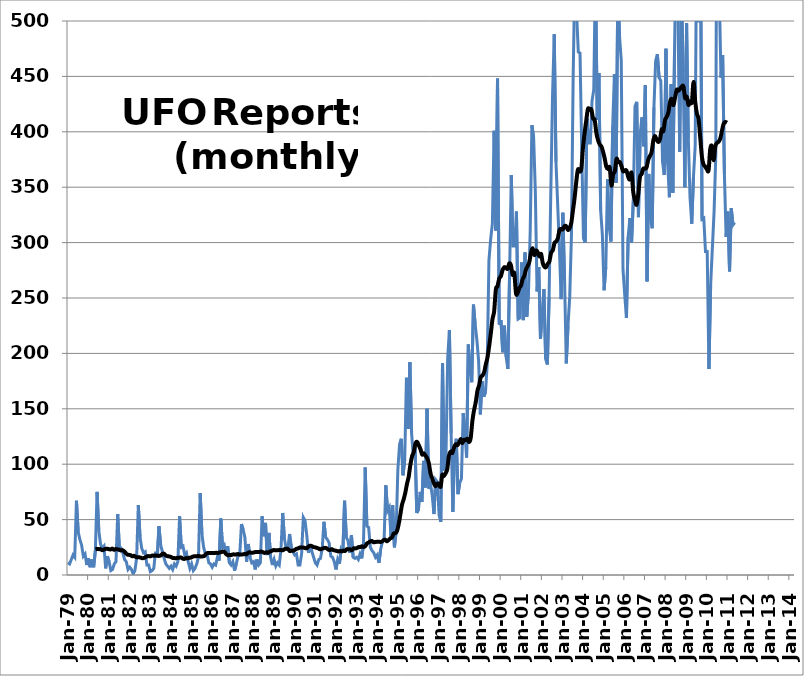
| Category | Series 0 |
|---|---|
| 1979-01-01 | 11 |
| 1979-02-01 | 10 |
| 1979-03-01 | 14 |
| 1979-04-01 | 18 |
| 1979-05-01 | 16 |
| 1979-06-01 | 67 |
| 1979-07-01 | 39 |
| 1979-08-01 | 32 |
| 1979-09-01 | 27 |
| 1979-10-01 | 17 |
| 1979-11-01 | 19 |
| 1979-12-01 | 9 |
| 1980-01-01 | 15 |
| 1980-02-01 | 7 |
| 1980-03-01 | 14 |
| 1980-04-01 | 7 |
| 1980-05-01 | 22 |
| 1980-06-01 | 75 |
| 1980-07-01 | 40 |
| 1980-08-01 | 28 |
| 1980-09-01 | 24 |
| 1980-10-01 | 26 |
| 1980-11-01 | 6 |
| 1980-12-01 | 17 |
| 1981-01-01 | 12 |
| 1981-02-01 | 4 |
| 1981-03-01 | 5 |
| 1981-04-01 | 10 |
| 1981-05-01 | 12 |
| 1981-06-01 | 55 |
| 1981-07-01 | 23 |
| 1981-08-01 | 24 |
| 1981-09-01 | 20 |
| 1981-10-01 | 14 |
| 1981-11-01 | 12 |
| 1981-12-01 | 5 |
| 1982-01-01 | 7 |
| 1982-02-01 | 5 |
| 1982-03-01 | 1 |
| 1982-04-01 | 4 |
| 1982-05-01 | 15 |
| 1982-06-01 | 63 |
| 1982-07-01 | 34 |
| 1982-08-01 | 24 |
| 1982-09-01 | 20 |
| 1982-10-01 | 21 |
| 1982-11-01 | 9 |
| 1982-12-01 | 9 |
| 1983-01-01 | 3 |
| 1983-02-01 | 4 |
| 1983-03-01 | 6 |
| 1983-04-01 | 21 |
| 1983-05-01 | 16 |
| 1983-06-01 | 44 |
| 1983-07-01 | 27 |
| 1983-08-01 | 21 |
| 1983-09-01 | 15 |
| 1983-10-01 | 10 |
| 1983-11-01 | 8 |
| 1983-12-01 | 6 |
| 1984-01-01 | 8 |
| 1984-02-01 | 5 |
| 1984-03-01 | 10 |
| 1984-04-01 | 8 |
| 1984-05-01 | 12 |
| 1984-06-01 | 53 |
| 1984-07-01 | 25 |
| 1984-08-01 | 26 |
| 1984-09-01 | 18 |
| 1984-10-01 | 20 |
| 1984-11-01 | 12 |
| 1984-12-01 | 6 |
| 1985-01-01 | 10 |
| 1985-02-01 | 4 |
| 1985-03-01 | 6 |
| 1985-04-01 | 10 |
| 1985-05-01 | 16 |
| 1985-06-01 | 74 |
| 1985-07-01 | 37 |
| 1985-08-01 | 25 |
| 1985-09-01 | 19 |
| 1985-10-01 | 19 |
| 1985-11-01 | 11 |
| 1985-12-01 | 10 |
| 1986-01-01 | 7 |
| 1986-02-01 | 10 |
| 1986-03-01 | 9 |
| 1986-04-01 | 16 |
| 1986-05-01 | 13 |
| 1986-06-01 | 51 |
| 1986-07-01 | 25 |
| 1986-08-01 | 27 |
| 1986-09-01 | 18 |
| 1986-10-01 | 26 |
| 1986-11-01 | 11 |
| 1986-12-01 | 9 |
| 1987-01-01 | 12 |
| 1987-02-01 | 4 |
| 1987-03-01 | 10 |
| 1987-04-01 | 17 |
| 1987-05-01 | 18 |
| 1987-06-01 | 46 |
| 1987-07-01 | 41 |
| 1987-08-01 | 34 |
| 1987-09-01 | 12 |
| 1987-10-01 | 28 |
| 1987-11-01 | 16 |
| 1987-12-01 | 11 |
| 1988-01-01 | 12 |
| 1988-02-01 | 5 |
| 1988-03-01 | 14 |
| 1988-04-01 | 9 |
| 1988-05-01 | 11 |
| 1988-06-01 | 53 |
| 1988-07-01 | 35 |
| 1988-08-01 | 47 |
| 1988-09-01 | 18 |
| 1988-10-01 | 38 |
| 1988-11-01 | 16 |
| 1988-12-01 | 9 |
| 1989-01-01 | 14 |
| 1989-02-01 | 8 |
| 1989-03-01 | 11 |
| 1989-04-01 | 9 |
| 1989-05-01 | 23 |
| 1989-06-01 | 56 |
| 1989-07-01 | 33 |
| 1989-08-01 | 24 |
| 1989-09-01 | 23 |
| 1989-10-01 | 37 |
| 1989-11-01 | 25 |
| 1989-12-01 | 21 |
| 1990-01-01 | 18 |
| 1990-02-01 | 19 |
| 1990-03-01 | 9 |
| 1990-04-01 | 9 |
| 1990-05-01 | 19 |
| 1990-06-01 | 52 |
| 1990-07-01 | 49 |
| 1990-08-01 | 36 |
| 1990-09-01 | 20 |
| 1990-10-01 | 27 |
| 1990-11-01 | 21 |
| 1990-12-01 | 16 |
| 1991-01-01 | 11 |
| 1991-02-01 | 9 |
| 1991-03-01 | 14 |
| 1991-04-01 | 15 |
| 1991-05-01 | 24 |
| 1991-06-01 | 48 |
| 1991-07-01 | 34 |
| 1991-08-01 | 32 |
| 1991-09-01 | 29 |
| 1991-10-01 | 17 |
| 1991-11-01 | 16 |
| 1991-12-01 | 12 |
| 1992-01-01 | 5 |
| 1992-02-01 | 14 |
| 1992-03-01 | 10 |
| 1992-04-01 | 23 |
| 1992-05-01 | 20 |
| 1992-06-01 | 67 |
| 1992-07-01 | 34 |
| 1992-08-01 | 31 |
| 1992-09-01 | 20 |
| 1992-10-01 | 36 |
| 1992-11-01 | 16 |
| 1992-12-01 | 15 |
| 1993-01-01 | 16 |
| 1993-02-01 | 14 |
| 1993-03-01 | 19 |
| 1993-04-01 | 15 |
| 1993-05-01 | 28 |
| 1993-06-01 | 97 |
| 1993-07-01 | 44 |
| 1993-08-01 | 43 |
| 1993-09-01 | 25 |
| 1993-10-01 | 22 |
| 1993-11-01 | 20 |
| 1993-12-01 | 16 |
| 1994-01-01 | 18 |
| 1994-02-01 | 11 |
| 1994-03-01 | 23 |
| 1994-04-01 | 30 |
| 1994-05-01 | 32 |
| 1994-06-01 | 81 |
| 1994-07-01 | 58 |
| 1994-08-01 | 61 |
| 1994-09-01 | 35 |
| 1994-10-01 | 63 |
| 1994-11-01 | 25 |
| 1994-12-01 | 39 |
| 1995-01-01 | 95 |
| 1995-02-01 | 118 |
| 1995-03-01 | 123 |
| 1995-04-01 | 90 |
| 1995-05-01 | 104 |
| 1995-06-01 | 178 |
| 1995-07-01 | 132 |
| 1995-08-01 | 192 |
| 1995-09-01 | 128 |
| 1995-10-01 | 107 |
| 1995-11-01 | 118 |
| 1995-12-01 | 56 |
| 1996-01-01 | 59 |
| 1996-02-01 | 75 |
| 1996-03-01 | 66 |
| 1996-04-01 | 103 |
| 1996-05-01 | 79 |
| 1996-06-01 | 150 |
| 1996-07-01 | 78 |
| 1996-08-01 | 82 |
| 1996-09-01 | 72 |
| 1996-10-01 | 55 |
| 1996-11-01 | 86 |
| 1996-12-01 | 84 |
| 1997-01-01 | 54 |
| 1997-02-01 | 48 |
| 1997-03-01 | 191 |
| 1997-04-01 | 94 |
| 1997-05-01 | 107 |
| 1997-06-01 | 196 |
| 1997-07-01 | 221 |
| 1997-08-01 | 128 |
| 1997-09-01 | 57 |
| 1997-10-01 | 113 |
| 1997-11-01 | 123 |
| 1997-12-01 | 73 |
| 1998-01-01 | 83 |
| 1998-02-01 | 87 |
| 1998-03-01 | 146 |
| 1998-04-01 | 130 |
| 1998-05-01 | 106 |
| 1998-06-01 | 208 |
| 1998-07-01 | 185 |
| 1998-08-01 | 174 |
| 1998-09-01 | 244 |
| 1998-10-01 | 226 |
| 1998-11-01 | 212 |
| 1998-12-01 | 193 |
| 1999-01-01 | 145 |
| 1999-02-01 | 175 |
| 1999-03-01 | 161 |
| 1999-04-01 | 165 |
| 1999-05-01 | 190 |
| 1999-06-01 | 284 |
| 1999-07-01 | 303 |
| 1999-08-01 | 317 |
| 1999-09-01 | 401 |
| 1999-10-01 | 311 |
| 1999-11-01 | 448 |
| 1999-12-01 | 226 |
| 2000-01-01 | 230 |
| 2000-02-01 | 201 |
| 2000-03-01 | 225 |
| 2000-04-01 | 197 |
| 2000-05-01 | 186 |
| 2000-06-01 | 271 |
| 2000-07-01 | 361 |
| 2000-08-01 | 297 |
| 2000-09-01 | 297 |
| 2000-10-01 | 328 |
| 2000-11-01 | 231 |
| 2000-12-01 | 232 |
| 2001-01-01 | 282 |
| 2001-02-01 | 230 |
| 2001-03-01 | 291 |
| 2001-04-01 | 233 |
| 2001-05-01 | 255 |
| 2001-06-01 | 309 |
| 2001-07-01 | 406 |
| 2001-08-01 | 395 |
| 2001-09-01 | 346 |
| 2001-10-01 | 256 |
| 2001-11-01 | 278 |
| 2001-12-01 | 213 |
| 2002-01-01 | 237 |
| 2002-02-01 | 258 |
| 2002-03-01 | 195 |
| 2002-04-01 | 190 |
| 2002-05-01 | 251 |
| 2002-06-01 | 346 |
| 2002-07-01 | 432 |
| 2002-08-01 | 488 |
| 2002-09-01 | 373 |
| 2002-10-01 | 334 |
| 2002-11-01 | 295 |
| 2002-12-01 | 249 |
| 2003-01-01 | 327 |
| 2003-02-01 | 267 |
| 2003-03-01 | 191 |
| 2003-04-01 | 225 |
| 2003-05-01 | 251 |
| 2003-06-01 | 306 |
| 2003-07-01 | 449 |
| 2003-08-01 | 543 |
| 2003-09-01 | 507 |
| 2003-10-01 | 472 |
| 2003-11-01 | 471 |
| 2003-12-01 | 383 |
| 2004-01-01 | 304 |
| 2004-02-01 | 300 |
| 2004-03-01 | 412 |
| 2004-04-01 | 390 |
| 2004-05-01 | 390 |
| 2004-06-01 | 428 |
| 2004-07-01 | 438 |
| 2004-08-01 | 547 |
| 2004-09-01 | 411 |
| 2004-10-01 | 453 |
| 2004-11-01 | 329 |
| 2004-12-01 | 307 |
| 2005-01-01 | 257 |
| 2005-02-01 | 278 |
| 2005-03-01 | 357 |
| 2005-04-01 | 314 |
| 2005-05-01 | 301 |
| 2005-06-01 | 405 |
| 2005-07-01 | 452 |
| 2005-08-01 | 354 |
| 2005-09-01 | 531 |
| 2005-10-01 | 486 |
| 2005-11-01 | 464 |
| 2005-12-01 | 276 |
| 2006-01-01 | 253 |
| 2006-02-01 | 232 |
| 2006-03-01 | 305 |
| 2006-04-01 | 322 |
| 2006-05-01 | 300 |
| 2006-06-01 | 338 |
| 2006-07-01 | 423 |
| 2006-08-01 | 427 |
| 2006-09-01 | 323 |
| 2006-10-01 | 398 |
| 2006-11-01 | 413 |
| 2006-12-01 | 387 |
| 2007-01-01 | 442 |
| 2007-02-01 | 265 |
| 2007-03-01 | 362 |
| 2007-04-01 | 322 |
| 2007-05-01 | 313 |
| 2007-06-01 | 422 |
| 2007-07-01 | 464 |
| 2007-08-01 | 470 |
| 2007-09-01 | 449 |
| 2007-10-01 | 446 |
| 2007-11-01 | 373 |
| 2007-12-01 | 361 |
| 2008-01-01 | 475 |
| 2008-02-01 | 371 |
| 2008-03-01 | 341 |
| 2008-04-01 | 443 |
| 2008-05-01 | 345 |
| 2008-06-01 | 475 |
| 2008-07-01 | 573 |
| 2008-08-01 | 504 |
| 2008-09-01 | 382 |
| 2008-10-01 | 532 |
| 2008-11-01 | 454 |
| 2008-12-01 | 350 |
| 2009-01-01 | 498 |
| 2009-02-01 | 394 |
| 2009-03-01 | 341 |
| 2009-04-01 | 317 |
| 2009-05-01 | 359 |
| 2009-06-01 | 387 |
| 2009-07-01 | 610 |
| 2009-08-01 | 499 |
| 2009-09-01 | 599 |
| 2009-10-01 | 321 |
| 2009-11-01 | 322 |
| 2009-12-01 | 292 |
| 2010-01-01 | 292 |
| 2010-02-01 | 186 |
| 2010-03-01 | 262 |
| 2010-04-01 | 295 |
| 2010-05-01 | 328 |
| 2010-06-01 | 379 |
| 2010-07-01 | 838 |
| 2010-08-01 | 528 |
| 2010-09-01 | 449 |
| 2010-10-01 | 469 |
| 2010-11-01 | 362 |
| 2010-12-01 | 305 |
| 2011-01-01 | 328 |
| 2011-02-01 | 274 |
| 2011-03-01 | 331 |
| 2011-04-01 | 316 |
| 2011-05-01 | 318 |